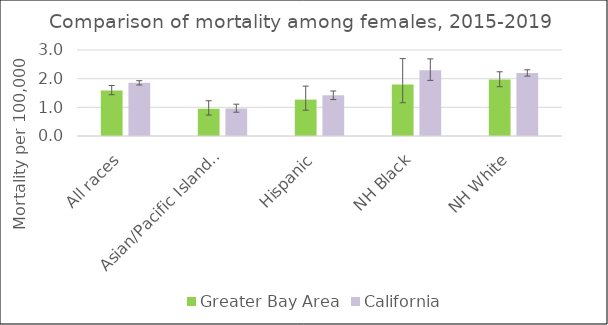
| Category | Greater Bay Area | California | US Mortality |
|---|---|---|---|
| All races | 1.59 | 1.86 |  |
| Asian/Pacific Islander | 0.95 | 0.96 |  |
| Hispanic | 1.27 | 1.42 |  |
| NH Black | 1.8 | 2.29 |  |
| NH White | 1.97 | 2.2 |  |